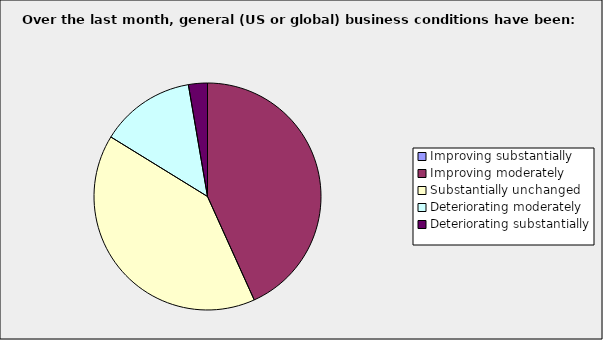
| Category | Series 0 |
|---|---|
| Improving substantially | 0 |
| Improving moderately | 0.432 |
| Substantially unchanged | 0.405 |
| Deteriorating moderately | 0.135 |
| Deteriorating substantially | 0.027 |